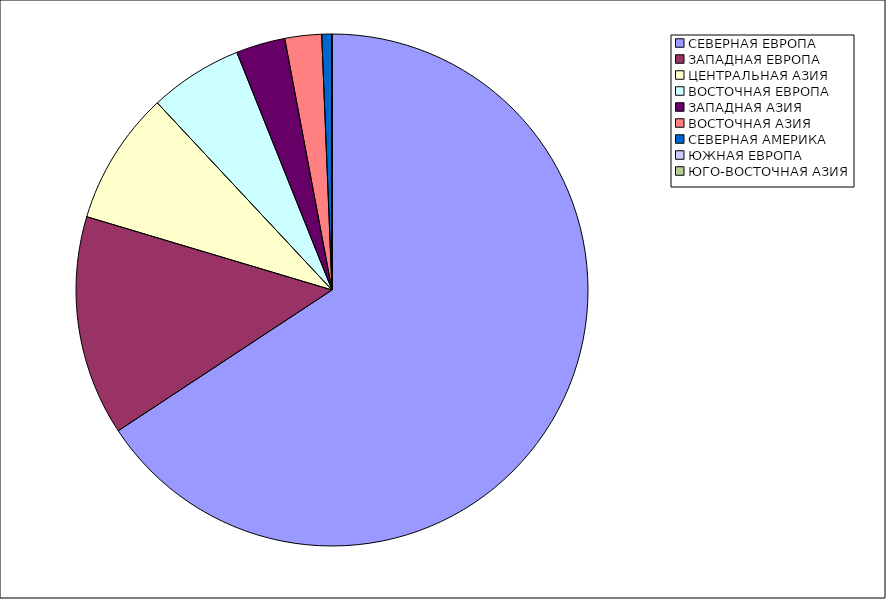
| Category | Оборот |
|---|---|
| СЕВЕРНАЯ ЕВРОПА | 65.73 |
| ЗАПАДНАЯ ЕВРОПА | 13.891 |
| ЦЕНТРАЛЬНАЯ АЗИЯ | 8.425 |
| ВОСТОЧНАЯ ЕВРОПА | 5.891 |
| ЗАПАДНАЯ АЗИЯ | 3.104 |
| ВОСТОЧНАЯ АЗИЯ | 2.317 |
| СЕВЕРНАЯ АМЕРИКА | 0.625 |
| ЮЖНАЯ ЕВРОПА | 0.016 |
| ЮГО-ВОСТОЧНАЯ АЗИЯ | 0.001 |